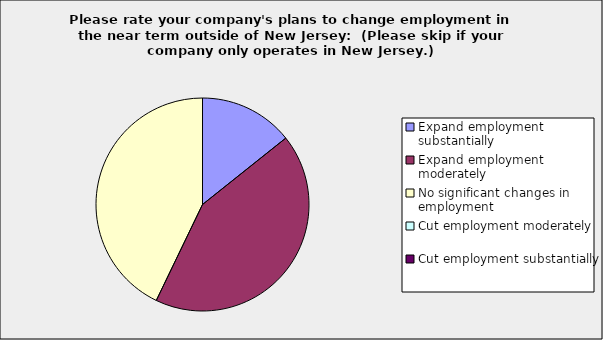
| Category | Series 0 |
|---|---|
| Expand employment substantially | 0.143 |
| Expand employment moderately | 0.429 |
| No significant changes in employment | 0.429 |
| Cut employment moderately | 0 |
| Cut employment substantially | 0 |